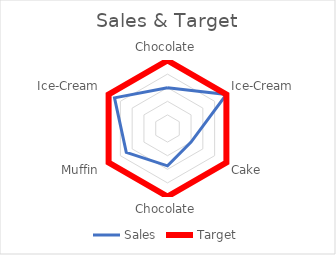
| Category | Sales | Target |
|---|---|---|
| Chocolate | 6000 | 10000 |
| Ice-Cream | 10000 | 10000 |
| Cake | 4000 | 10000 |
| Chocolate | 5500 | 10000 |
| Muffin | 7000 | 10000 |
| Ice-Cream | 9000 | 10000 |